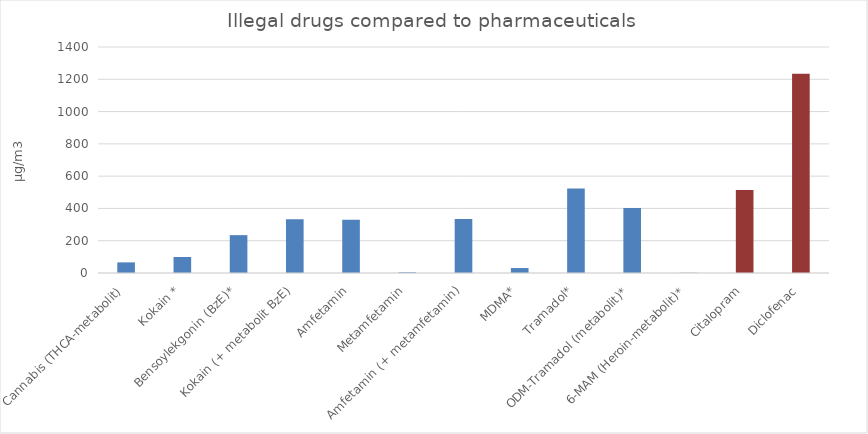
| Category | Series 0 |
|---|---|
| Cannabis (THCA-metabolit) | 65.8 |
| Kokain * | 99.2 |
| Bensoylekgonin (BzE)* | 234.467 |
| Kokain (+ metabolit BzE) | 333.633 |
| Amfetamin | 329.633 |
| Metamfetamin | 4.3 |
| Amfetamin (+ metamfetamin) | 333.933 |
| MDMA* | 30.633 |
| Tramadol* | 524.067 |
| ODM-Tramadol (metabolit)* | 402.533 |
| 6-MAM (Heroin-metabolit)* | 1.4 |
| Citalopram | 514 |
| Diclofenac | 1235 |